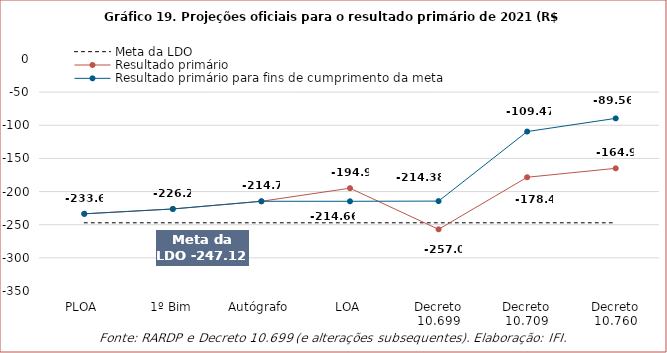
| Category | Meta da LDO | Resultado primário | Resultado primário para fins de cumprimento da meta |
|---|---|---|---|
| PLOA | -247.118 | -233.568 | -233.568 |
| 1º Bim | -247.118 | -226.238 | -226.238 |
| Autógrafo | -247.118 | -214.664 | -214.664 |
| LOA | -247.118 | -194.896 | -214.664 |
| Decreto 10.699 | -247.118 | -256.958 | -214.382 |
| Decreto 10.709 | -247.118 | -178.398 | -109.466 |
| Decreto 10.760 | -247.118 | -164.915 | -89.558 |